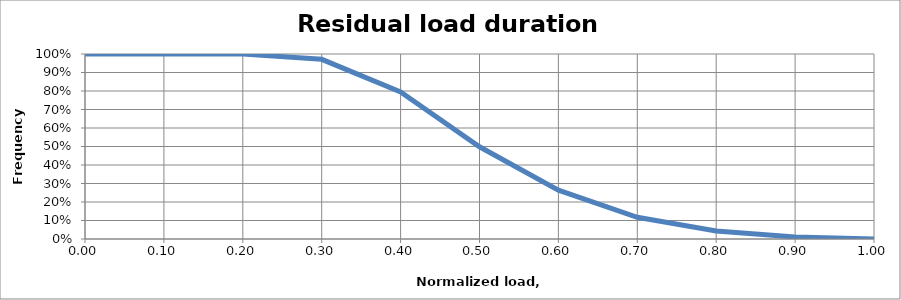
| Category | frequency |
|---|---|
| 0.0 | 1 |
| 0.1 | 1 |
| 0.2 | 1 |
| 0.3 | 0.971 |
| 0.4 | 0.795 |
| 0.5 | 0.499 |
| 0.6 | 0.264 |
| 0.7 | 0.117 |
| 0.8 | 0.043 |
| 0.9 | 0.011 |
| 1.0 | 0 |